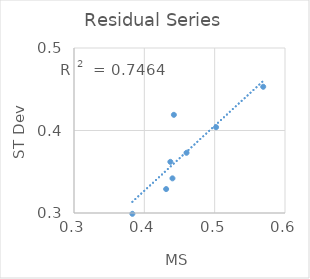
| Category | res-stdev |
|---|---|
| 0.437 | 0.362 |
| 0.44 | 0.342 |
| 0.569 | 0.453 |
| 0.502 | 0.404 |
| 0.383 | 0.299 |
| 0.442 | 0.419 |
| 0.46 | 0.373 |
| 0.431 | 0.329 |